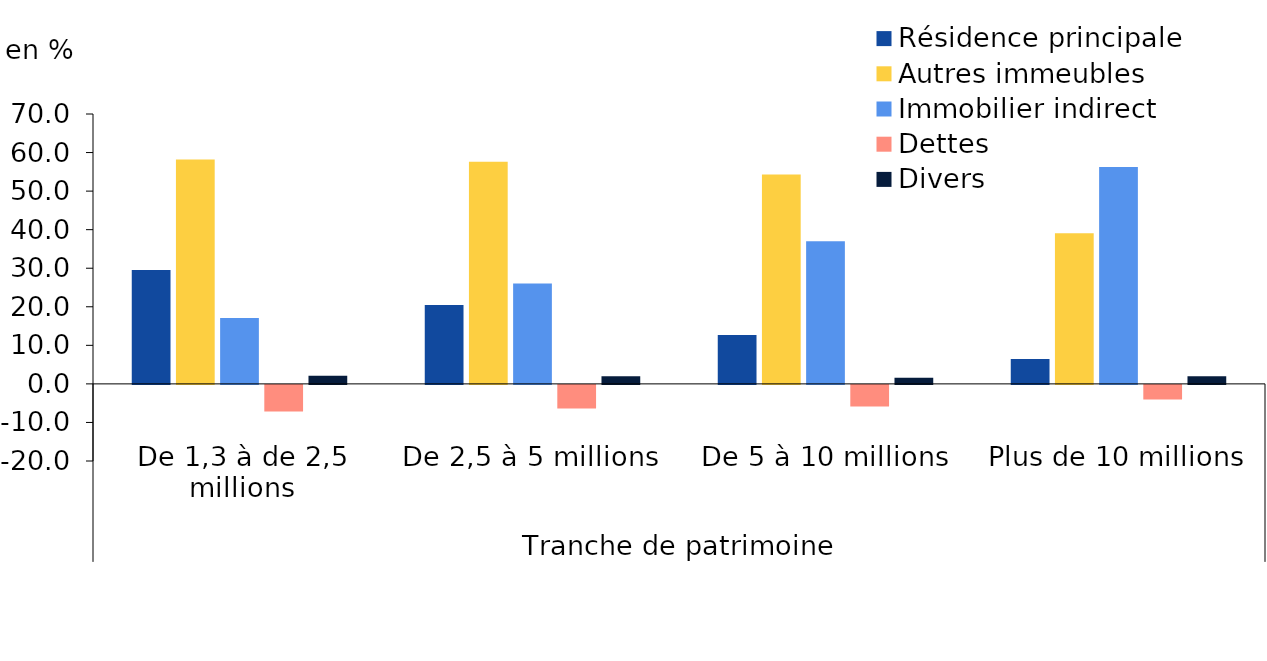
| Category | Résidence principale | Autres immeubles | Immobilier indirect | Dettes | Divers |
|---|---|---|---|---|---|
| 0 | 29.549 | 58.18 | 17.067 | -6.922 | 2.127 |
| 1 | 20.472 | 57.601 | 26.034 | -6.116 | 2.009 |
| 2 | 12.694 | 54.279 | 37.001 | -5.594 | 1.621 |
| 3 | 6.463 | 39.044 | 56.281 | -3.776 | 1.988 |